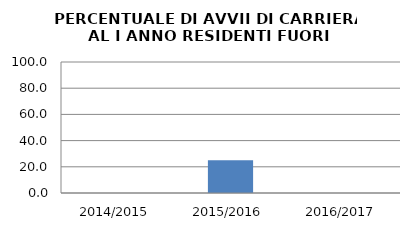
| Category | 2014/2015 2015/2016 2016/2017 |
|---|---|
| 2014/2015 | 0 |
| 2015/2016 | 25 |
| 2016/2017 | 0 |